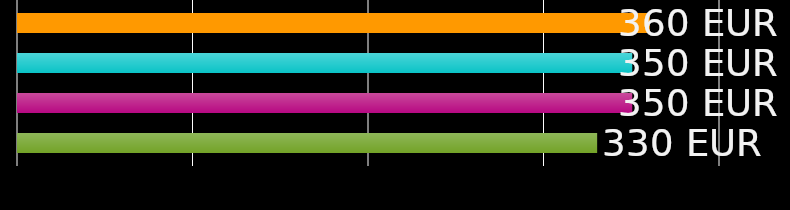
| Category | spolubývajúci 1 | spolubývajúci 2 | spolubývajúci 3 | spolubývajúci 4 |
|---|---|---|---|---|
| 0 | 360 | 350 | 350 | 330 |